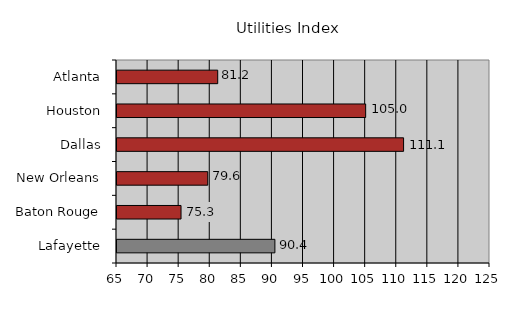
| Category | 90.4 |
|---|---|
| Lafayette | 90.4 |
| Baton Rouge | 75.3 |
| New Orleans | 79.6 |
| Dallas | 111.1 |
| Houston | 105 |
| Atlanta | 81.2 |